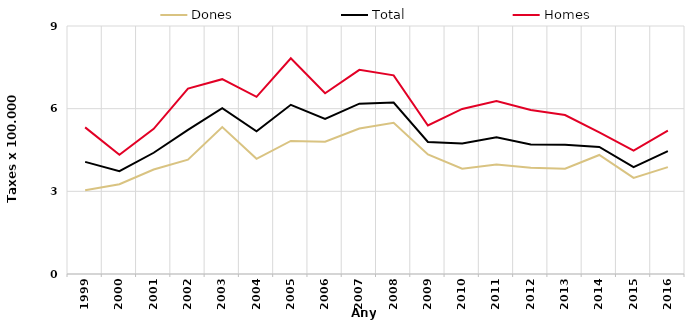
| Category | Dones | Total | Homes |
|---|---|---|---|
| 1999.0 | 3.04 | 4.07 | 5.32 |
| 2000.0 | 3.26 | 3.73 | 4.33 |
| 2001.0 | 3.79 | 4.4 | 5.27 |
| 2002.0 | 4.15 | 5.23 | 6.73 |
| 2003.0 | 5.33 | 6.02 | 7.07 |
| 2004.0 | 4.18 | 5.18 | 6.43 |
| 2005.0 | 4.83 | 6.14 | 7.83 |
| 2006.0 | 4.8 | 5.63 | 6.56 |
| 2007.0 | 5.28 | 6.18 | 7.41 |
| 2008.0 | 5.49 | 6.22 | 7.21 |
| 2009.0 | 4.34 | 4.79 | 5.39 |
| 2010.0 | 3.82 | 4.74 | 5.99 |
| 2011.0 | 3.97 | 4.96 | 6.28 |
| 2012.0 | 3.86 | 4.7 | 5.95 |
| 2013.0 | 3.82 | 4.69 | 5.77 |
| 2014.0 | 4.32 | 4.61 | 5.14 |
| 2015.0 | 3.49 | 3.88 | 4.48 |
| 2016.0 | 3.88 | 4.46 | 5.2 |